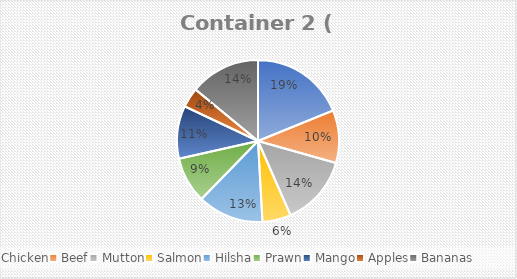
| Category | Container 2 ( kg) |
|---|---|
| Chicken | 430 |
| Beef | 240 |
| Mutton | 320 |
| Salmon | 130 |
| Hilsha | 300 |
| Prawn | 210 |
| Mango | 240 |
| Apples | 90 |
| Bananas | 320 |